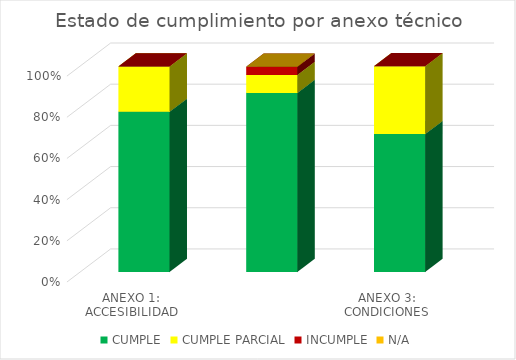
| Category | CUMPLE | CUMPLE PARCIAL | INCUMPLE | N/A |
|---|---|---|---|---|
| ANEXO 1: ACCESIBILIDAD | 0.778 | 0.22 | 0 | 0 |
| ANEXO  2: ESTÁNDARES DE PUBLICACIÓN SEDE ELECTRÓNICA Y WEB  | 0.87 | 0.087 | 0.04 | 0 |
| ANEXO 3: CONDICIONES MÍNIMAS TÉCNICAS Y DE SEGURIDAD DIGITAL | 0.67 | 0.33 | 0 | 0 |